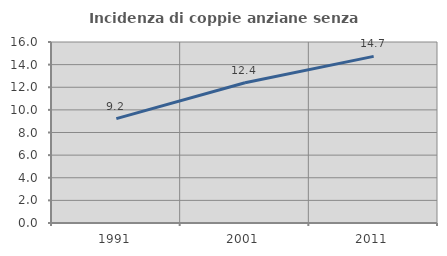
| Category | Incidenza di coppie anziane senza figli  |
|---|---|
| 1991.0 | 9.228 |
| 2001.0 | 12.394 |
| 2011.0 | 14.732 |